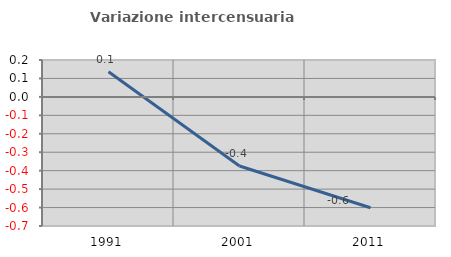
| Category | Variazione intercensuaria annua |
|---|---|
| 1991.0 | 0.137 |
| 2001.0 | -0.375 |
| 2011.0 | -0.601 |